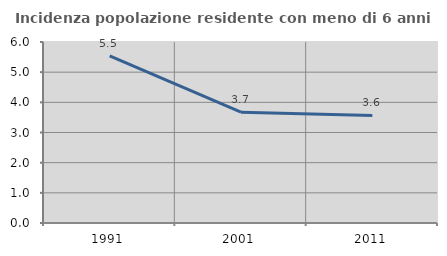
| Category | Incidenza popolazione residente con meno di 6 anni |
|---|---|
| 1991.0 | 5.538 |
| 2001.0 | 3.672 |
| 2011.0 | 3.566 |